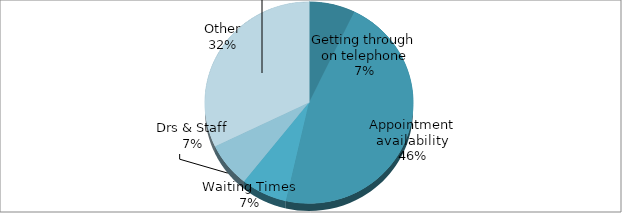
| Category | Series 0 |
|---|---|
| Getting through on telephone | 2 |
| Appointment availability | 13 |
| Waiting Times | 2 |
| Drs & Staff | 2 |
| Other | 9 |